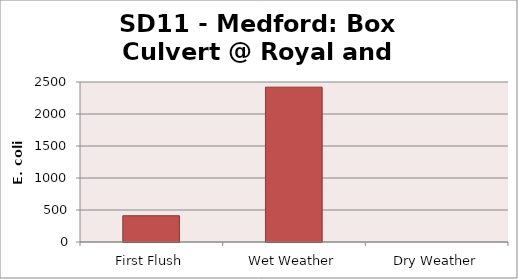
| Category | E. coli MPN |
|---|---|
| First Flush | 410.6 |
| Wet Weather | 2419.2 |
| Dry Weather | 0 |